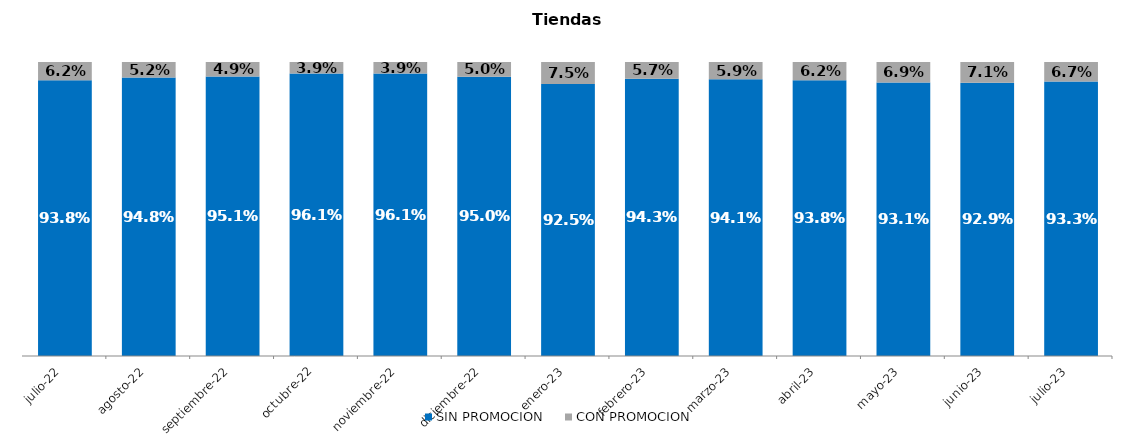
| Category | SIN PROMOCION   | CON PROMOCION   |
|---|---|---|
| 2022-07-01 | 0.938 | 0.062 |
| 2022-08-01 | 0.948 | 0.052 |
| 2022-09-01 | 0.951 | 0.049 |
| 2022-10-01 | 0.961 | 0.039 |
| 2022-11-01 | 0.961 | 0.039 |
| 2022-12-01 | 0.95 | 0.05 |
| 2023-01-01 | 0.925 | 0.075 |
| 2023-02-01 | 0.943 | 0.057 |
| 2023-03-01 | 0.941 | 0.059 |
| 2023-04-01 | 0.938 | 0.062 |
| 2023-05-01 | 0.931 | 0.069 |
| 2023-06-01 | 0.929 | 0.071 |
| 2023-07-01 | 0.933 | 0.067 |